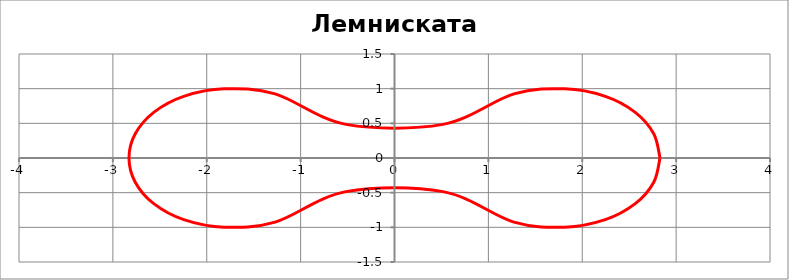
| Category | Лемниската Бернулли |
|---|---|
| 2.8284271247461903 | 0 |
| 2.7616925977744615 | 0.349 |
| 2.5645429047168324 | 0.658 |
| 2.2453185851331376 | 0.889 |
| 1.8143176669993162 | 0.997 |
| 1.272019649514069 | 0.924 |
| 0.5166552772287326 | 0.485 |
| 0.0 | 0 |
| 0.0 | 0 |
| 0.0 | 0 |
| 0.0 | 0 |
| 0.0 | 0 |
| 0.0 | 0 |
| 0.0 | 0 |
| 0.0 | 0 |
| 0.0 | 0 |
| 0.0 | 0 |
| 0.0 | 0 |
| 0.0 | 0 |
| -0.5166552772287296 | 0.485 |
| -1.2720196495140685 | 0.924 |
| -1.8143176669993164 | 0.997 |
| -2.2453185851331368 | 0.889 |
| -2.564542904716831 | 0.658 |
| -2.761692597774461 | 0.349 |
| -2.8284271247461903 | 0 |
| -2.7616925977744615 | -0.349 |
| -2.564542904716833 | -0.658 |
| -2.2453185851331376 | -0.889 |
| -1.8143176669993155 | -0.997 |
| -1.2720196495140719 | -0.924 |
| -0.5166552772287356 | -0.485 |
| 0.0 | 0 |
| 0.0 | 0 |
| 0.0 | 0 |
| 0.0 | 0 |
| 0.0 | 0 |
| 0.0 | 0 |
| 0.0 | 0 |
| 0.0 | 0 |
| 0.0 | 0 |
| 0.0 | 0 |
| 0.0 | 0 |
| 0.0 | 0 |
| 0.5166552772287285 | -0.485 |
| 1.272019649514068 | -0.924 |
| 1.8143176669993124 | -0.997 |
| 2.2453185851331376 | -0.889 |
| 2.564542904716831 | -0.658 |
| 2.761692597774461 | -0.349 |
| 2.8284271247461903 | 0 |